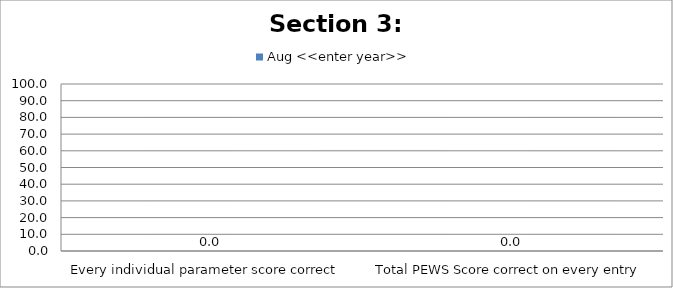
| Category | Aug <<enter year>> |
|---|---|
| Every individual parameter score correct  | 0 |
| Total PEWS Score correct on every entry | 0 |